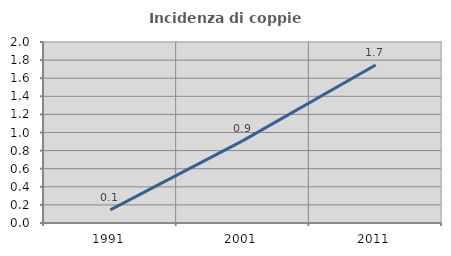
| Category | Incidenza di coppie miste |
|---|---|
| 1991.0 | 0.145 |
| 2001.0 | 0.91 |
| 2011.0 | 1.746 |